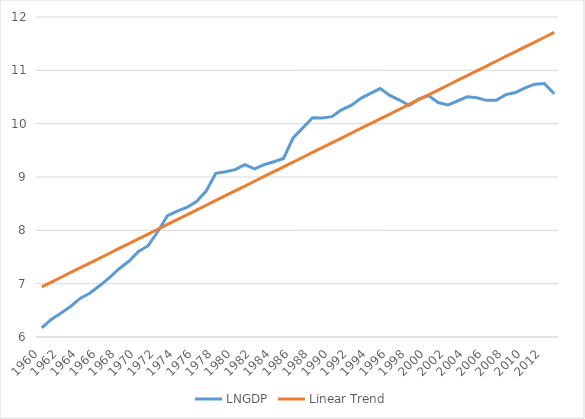
| Category | LNGDP | Linear Trend |
|---|---|---|
| 1960.0 | 6.172 | 6.94 |
| 1961.0 | 6.334 | 7.03 |
| 1962.0 | 6.451 | 7.12 |
| 1963.0 | 6.576 | 7.21 |
| 1964.0 | 6.728 | 7.3 |
| 1965.0 | 6.824 | 7.39 |
| 1966.0 | 6.965 | 7.48 |
| 1967.0 | 7.114 | 7.57 |
| 1968.0 | 7.28 | 7.66 |
| 1969.0 | 7.42 | 7.75 |
| 1970.0 | 7.603 | 7.84 |
| 1971.0 | 7.712 | 7.93 |
| 1972.0 | 7.979 | 8.02 |
| 1973.0 | 8.277 | 8.11 |
| 1974.0 | 8.362 | 8.2 |
| 1975.0 | 8.43 | 8.29 |
| 1976.0 | 8.539 | 8.38 |
| 1977.0 | 8.737 | 8.47 |
| 1978.0 | 9.068 | 8.56 |
| 1979.0 | 9.1 | 8.65 |
| 1980.0 | 9.139 | 8.74 |
| 1981.0 | 9.231 | 8.83 |
| 1982.0 | 9.152 | 8.92 |
| 1983.0 | 9.232 | 9.01 |
| 1984.0 | 9.286 | 9.1 |
| 1985.0 | 9.347 | 9.19 |
| 1986.0 | 9.734 | 9.28 |
| 1987.0 | 9.921 | 9.37 |
| 1988.0 | 10.11 | 9.46 |
| 1989.0 | 10.107 | 9.55 |
| 1990.0 | 10.132 | 9.64 |
| 1991.0 | 10.259 | 9.73 |
| 1992.0 | 10.342 | 9.82 |
| 1993.0 | 10.476 | 9.91 |
| 1994.0 | 10.567 | 10 |
| 1995.0 | 10.658 | 10.09 |
| 1996.0 | 10.53 | 10.18 |
| 1997.0 | 10.443 | 10.27 |
| 1998.0 | 10.341 | 10.36 |
| 1999.0 | 10.463 | 10.45 |
| 2000.0 | 10.527 | 10.54 |
| 2001.0 | 10.396 | 10.63 |
| 2002.0 | 10.349 | 10.72 |
| 2003.0 | 10.425 | 10.81 |
| 2004.0 | 10.503 | 10.9 |
| 2005.0 | 10.485 | 10.99 |
| 2006.0 | 10.437 | 11.08 |
| 2007.0 | 10.437 | 11.17 |
| 2008.0 | 10.545 | 11.26 |
| 2009.0 | 10.583 | 11.35 |
| 2010.0 | 10.672 | 11.44 |
| 2011.0 | 10.741 | 11.53 |
| 2012.0 | 10.751 | 11.62 |
| 2013.0 | 10.562 | 11.71 |